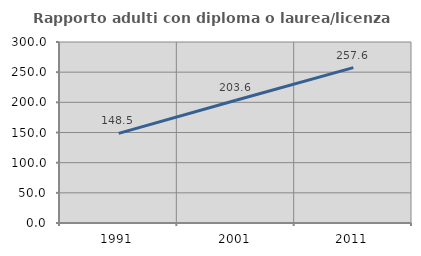
| Category | Rapporto adulti con diploma o laurea/licenza media  |
|---|---|
| 1991.0 | 148.5 |
| 2001.0 | 203.558 |
| 2011.0 | 257.613 |